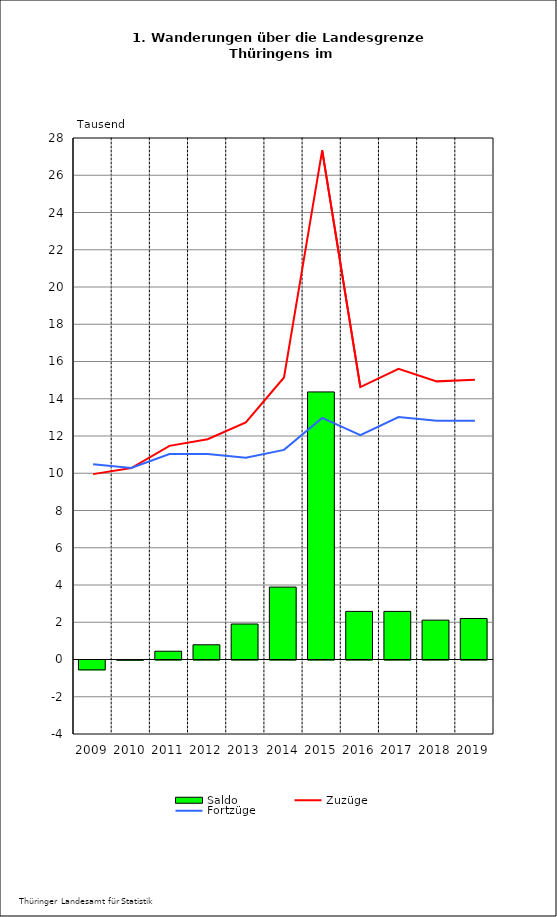
| Category | Saldo |
|---|---|
| 2009.0 | -0.53 |
| 2010.0 | -0.012 |
| 2011.0 | 0.443 |
| 2012.0 | 0.79 |
| 2013.0 | 1.906 |
| 2014.0 | 3.889 |
| 2015.0 | 14.366 |
| 2016.0 | 2.583 |
| 2017.0 | 2.583 |
| 2018.0 | 2.114 |
| 2019.0 | 2.202 |